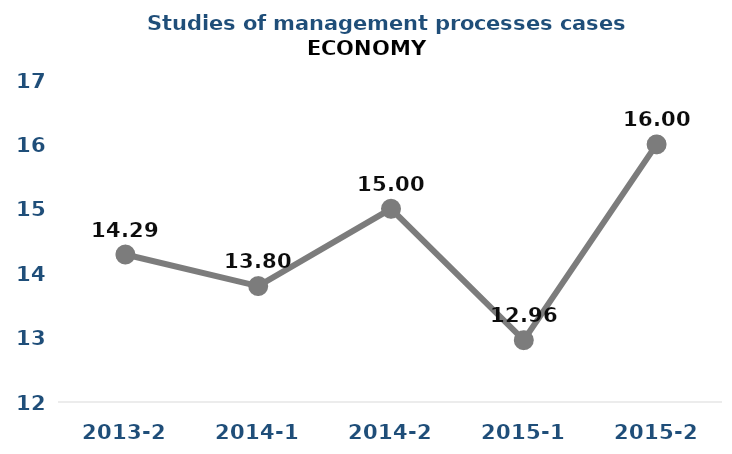
| Category | Series 0 |
|---|---|
| 2013-2 | 14.29 |
| 2014-1 | 13.8 |
| 2014-2 | 15 |
| 2015-1 | 12.96 |
| 2015-2 | 16 |